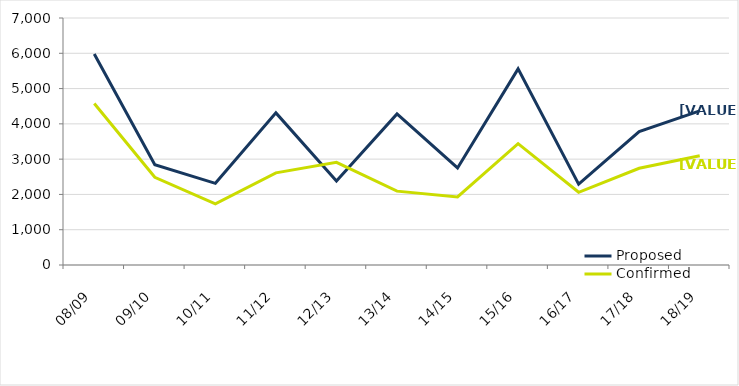
| Category | Proposed | Confirmed |
|---|---|---|
| 08/09 | 5981 | 4576 |
| 09/10 | 2844 | 2486 |
| 10/11 | 2315 | 1733 |
| 11/12 | 4311 | 2612 |
| 12/13 | 2382 | 2910 |
| 13/14 | 4283 | 2093 |
| 14/15 | 2751 | 1928 |
| 15/16 | 5559 | 3440 |
| 16/17 | 2291 | 2061 |
| 17/18 | 3781 | 2742 |
| 18/19 | 4368 | 3096 |